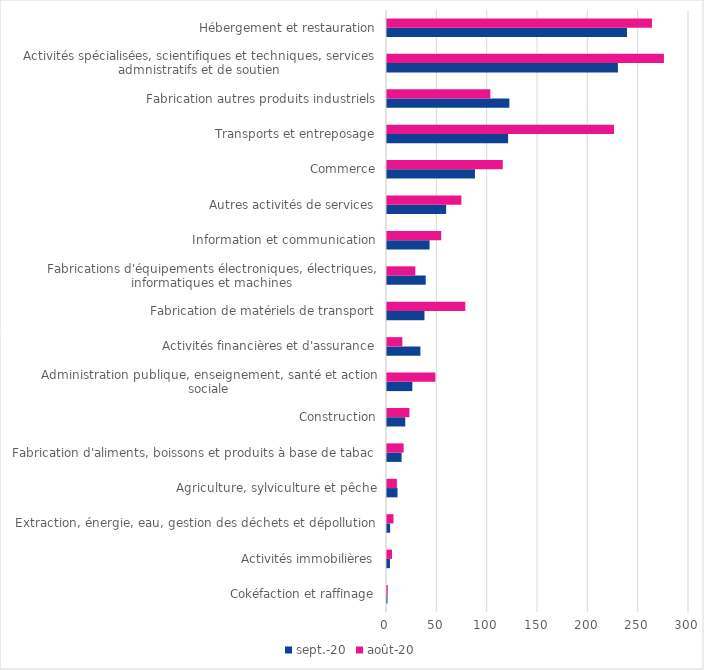
| Category | sept.-20 | août-20 |
|---|---|---|
| Cokéfaction et raffinage | 0.507 | 0.777 |
| Activités immobilières | 2.931 | 4.983 |
| Extraction, énergie, eau, gestion des déchets et dépollution | 3.073 | 6.441 |
| Agriculture, sylviculture et pêche | 10.437 | 9.823 |
| Fabrication d'aliments, boissons et produits à base de tabac | 14.482 | 16.528 |
| Construction | 18.148 | 22.312 |
| Administration publique, enseignement, santé et action sociale | 25.173 | 48.096 |
| Activités financières et d'assurance | 33.185 | 15.24 |
| Fabrication de matériels de transport | 37.217 | 77.804 |
| Fabrications d'équipements électroniques, électriques, informatiques et machines | 38.459 | 28.161 |
| Information et communication | 42.298 | 53.839 |
| Autres activités de services | 58.732 | 73.906 |
| Commerce | 87.376 | 115.006 |
| Transports et entreposage | 120.308 | 225.512 |
| Fabrication autres produits industriels | 121.569 | 102.648 |
| Activités spécialisées, scientifiques et techniques, services admnistratifs et de soutien | 229.383 | 275.089 |
| Hébergement et restauration | 238.39 | 263.185 |